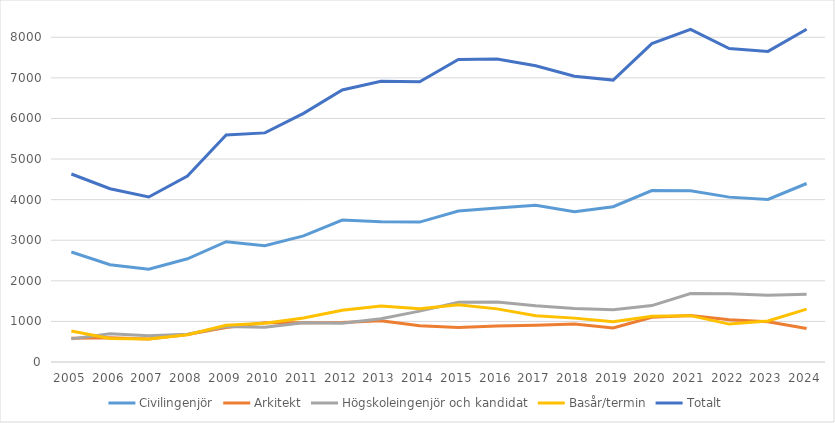
| Category | Civilingenjör | Arkitekt | Högskoleingenjör och kandidat | Basår/termin | Totalt |
|---|---|---|---|---|---|
| 2005.0 | 2710 | 587 | 570 | 765 | 4632 |
| 2006.0 | 2397 | 595 | 698 | 578 | 4268 |
| 2007.0 | 2286 | 569 | 645 | 565 | 4065 |
| 2008.0 | 2543 | 679 | 685 | 672 | 4579 |
| 2009.0 | 2964 | 849 | 875 | 903 | 5591 |
| 2010.0 | 2865 | 965 | 859 | 956 | 5645 |
| 2011.0 | 3107 | 967 | 967 | 1086 | 6127 |
| 2012.0 | 3497 | 975 | 952 | 1277 | 6701 |
| 2013.0 | 3457 | 1016 | 1065 | 1377 | 6915 |
| 2014.0 | 3447 | 894 | 1254 | 1311 | 6906 |
| 2015.0 | 3719 | 852 | 1473 | 1409 | 7453 |
| 2016.0 | 3793 | 884 | 1478 | 1309 | 7464 |
| 2017.0 | 3864 | 908 | 1387 | 1140 | 7299 |
| 2018.0 | 3702 | 938 | 1320 | 1081 | 7041 |
| 2019.0 | 3827 | 836 | 1289 | 994 | 6946 |
| 2020.0 | 4224 | 1104 | 1390 | 1126 | 7844 |
| 2021.0 | 4221 | 1145 | 1688 | 1142 | 8196 |
| 2022.0 | 4062 | 1043 | 1682 | 934 | 7721 |
| 2023.0 | 4006 | 989 | 1647 | 1010 | 7652 |
| 2024.0 | 4398 | 824 | 1672 | 1304 | 8198 |